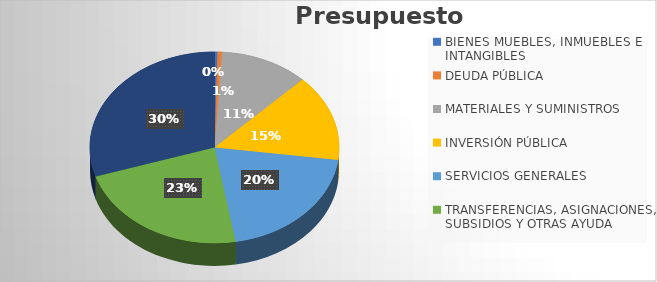
| Category | Presupuesto 2023 |
|---|---|
| BIENES MUEBLES, INMUEBLES E INTANGIBLES | 0.004 |
| DEUDA PÚBLICA | 0.006 |
| MATERIALES Y SUMINISTROS | 0.115 |
| INVERSIÓN PÚBLICA | 0.147 |
| SERVICIOS GENERALES | 0.202 |
| TRANSFERENCIAS, ASIGNACIONES, SUBSIDIOS Y OTRAS AYUDA | 0.228 |
| SERVICIOS PERSONALES | 0.299 |